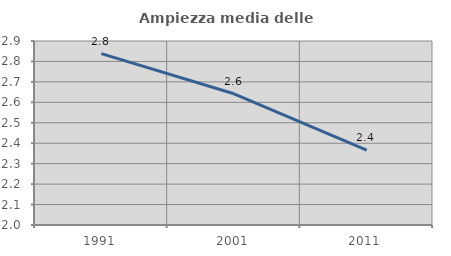
| Category | Ampiezza media delle famiglie |
|---|---|
| 1991.0 | 2.838 |
| 2001.0 | 2.642 |
| 2011.0 | 2.366 |